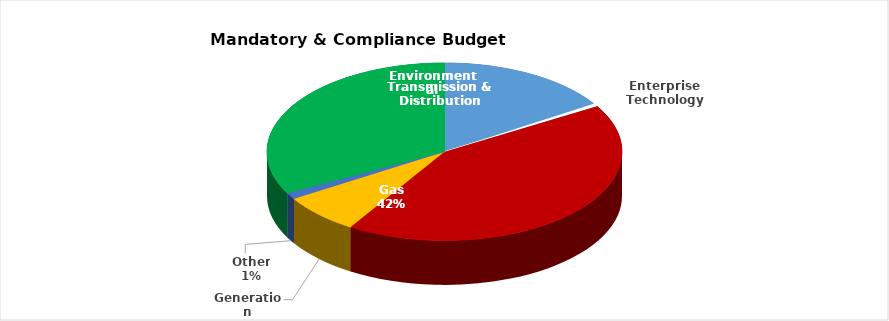
| Category | Series 0 |
|---|---|
| Environmental | 58833982 |
| Enterprise Technology | 2000000 |
| Gas | 157126893 |
| Generation | 26795000 |
| Other | 4151600 |
| Transmission & Distribution | 121386000 |